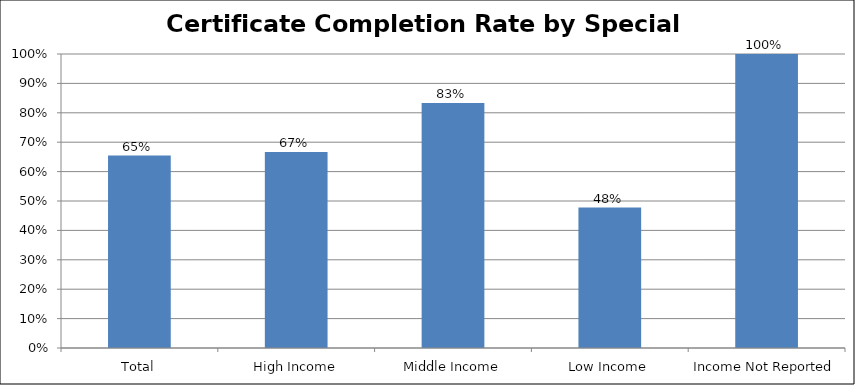
| Category | Certificate Completion by Socioeconomic Status |
|---|---|
| Total | 0.655 |
| High Income | 0.667 |
| Middle Income | 0.833 |
| Low Income | 0.478 |
| Income Not Reported | 1 |